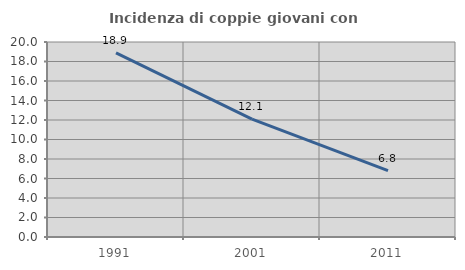
| Category | Incidenza di coppie giovani con figli |
|---|---|
| 1991.0 | 18.889 |
| 2001.0 | 12.097 |
| 2011.0 | 6.817 |